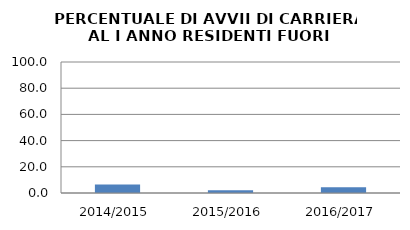
| Category | 2014/2015 2015/2016 2016/2017 |
|---|---|
| 2014/2015 | 6.41 |
| 2015/2016 | 2.083 |
| 2016/2017 | 4.301 |